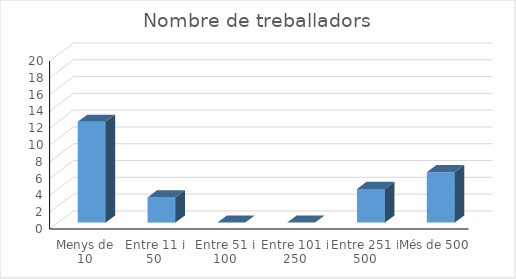
| Category | Series 0 |
|---|---|
| Menys de 10 | 12 |
| Entre 11 i 50 | 3 |
| Entre 51 i 100 | 0 |
| Entre 101 i 250 | 0 |
| Entre 251 i 500 | 4 |
| Més de 500 | 6 |